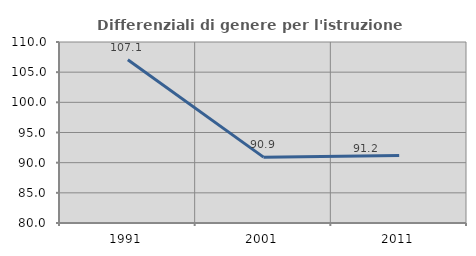
| Category | Differenziali di genere per l'istruzione superiore |
|---|---|
| 1991.0 | 107.07 |
| 2001.0 | 90.916 |
| 2011.0 | 91.177 |